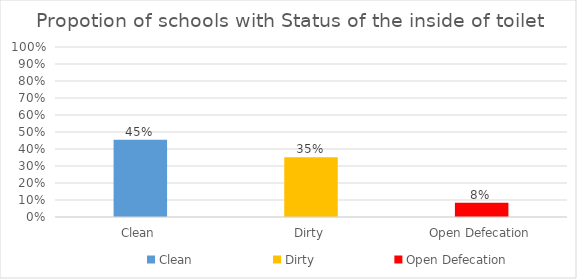
| Category | Status |
|---|---|
| Clean | 0.455 |
| Dirty | 0.351 |
| Open Defecation | 0.084 |